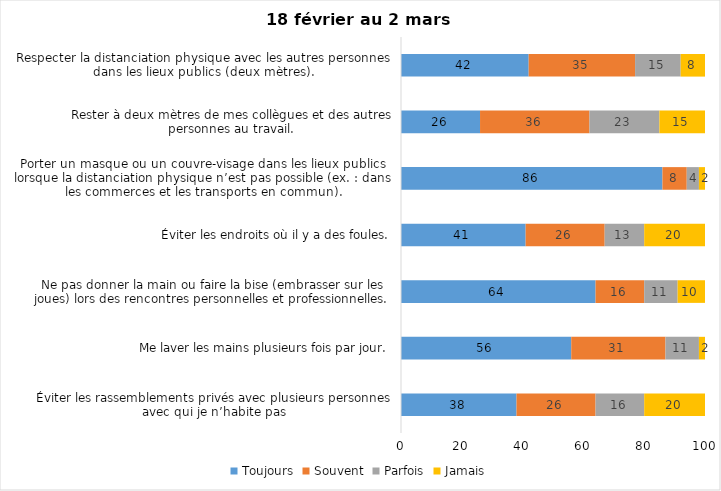
| Category | Toujours | Souvent | Parfois | Jamais |
|---|---|---|---|---|
| Éviter les rassemblements privés avec plusieurs personnes avec qui je n’habite pas | 38 | 26 | 16 | 20 |
| Me laver les mains plusieurs fois par jour. | 56 | 31 | 11 | 2 |
| Ne pas donner la main ou faire la bise (embrasser sur les joues) lors des rencontres personnelles et professionnelles. | 64 | 16 | 11 | 10 |
| Éviter les endroits où il y a des foules. | 41 | 26 | 13 | 20 |
| Porter un masque ou un couvre-visage dans les lieux publics lorsque la distanciation physique n’est pas possible (ex. : dans les commerces et les transports en commun). | 86 | 8 | 4 | 2 |
| Rester à deux mètres de mes collègues et des autres personnes au travail. | 26 | 36 | 23 | 15 |
| Respecter la distanciation physique avec les autres personnes dans les lieux publics (deux mètres). | 42 | 35 | 15 | 8 |